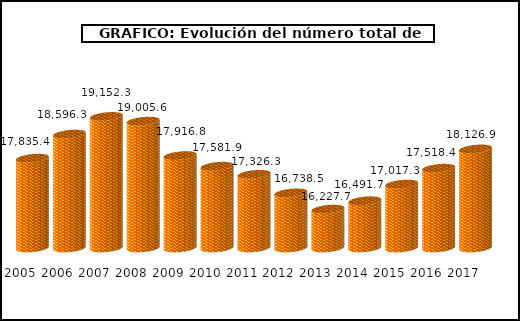
| Category | Series1 |
|---|---|
| 2005.0 | 17835.4 |
| 2006.0 | 18596.3 |
| 2007.0 | 19152.3 |
| 2008.0 | 19005.6 |
| 2009.0 | 17916.8 |
| 2010.0 | 17581.9 |
| 2011.0 | 17326.3 |
| 2012.0 | 16738.5 |
| 2013.0 | 16227.7 |
| 2014.0 | 16491.7 |
| 2015.0 | 17017.3 |
| 2016.0 | 17518.4 |
| 2017.0 | 18126.9 |